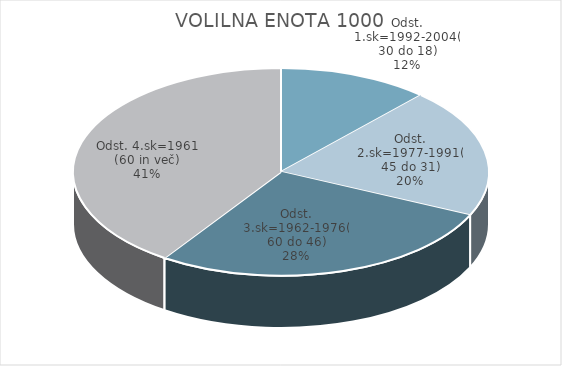
| Category | VOLILNA ENOTA 1000 |
|---|---|
| Odst. 1.sk=1992-2004(30 do 18) | 6.6 |
| Odst. 2.sk=1977-1991(45 do 31) | 11.29 |
| Odst. 3.sk=1962-1976(60 do 46) | 15.51 |
| Odst. 4.sk=1961 (60 in več) | 22.78 |